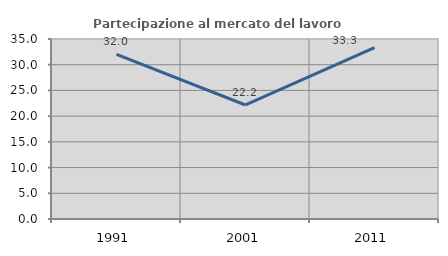
| Category | Partecipazione al mercato del lavoro  femminile |
|---|---|
| 1991.0 | 32 |
| 2001.0 | 22.17 |
| 2011.0 | 33.333 |